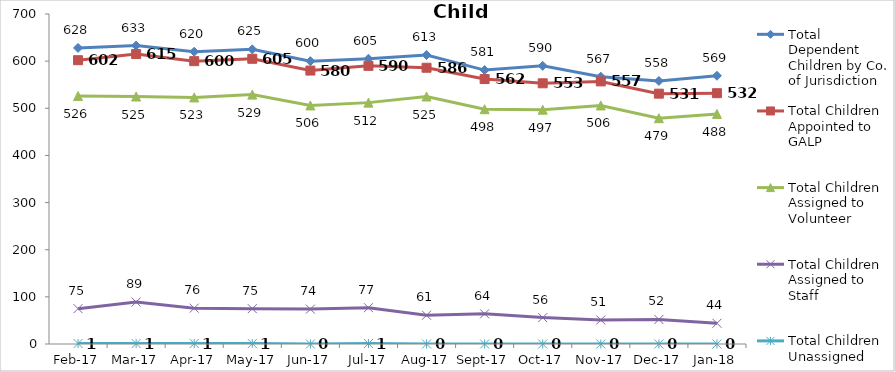
| Category | Total Dependent Children by Co. of Jurisdiction | Total Children Appointed to GALP | Total Children Assigned to Volunteer | Total Children Assigned to Staff | Total Children Unassigned |
|---|---|---|---|---|---|
| 2017-02-01 | 628 | 602 | 526 | 75 | 1 |
| 2017-03-01 | 633 | 615 | 525 | 89 | 1 |
| 2017-04-01 | 620 | 600 | 523 | 76 | 1 |
| 2017-05-01 | 625 | 605 | 529 | 75 | 1 |
| 2017-06-01 | 600 | 580 | 506 | 74 | 0 |
| 2017-07-01 | 605 | 590 | 512 | 77 | 1 |
| 2017-08-01 | 613 | 586 | 525 | 61 | 0 |
| 2017-09-01 | 581 | 562 | 498 | 64 | 0 |
| 2017-10-01 | 590 | 553 | 497 | 56 | 0 |
| 2017-11-01 | 567 | 557 | 506 | 51 | 0 |
| 2017-12-01 | 558 | 531 | 479 | 52 | 0 |
| 2018-01-01 | 569 | 532 | 488 | 44 | 0 |